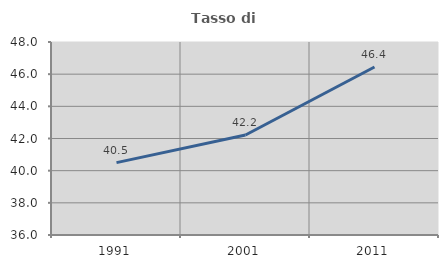
| Category | Tasso di occupazione   |
|---|---|
| 1991.0 | 40.498 |
| 2001.0 | 42.215 |
| 2011.0 | 46.447 |